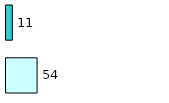
| Category | Series 0 | Series 1 |
|---|---|---|
| 0 | 54 | 11 |